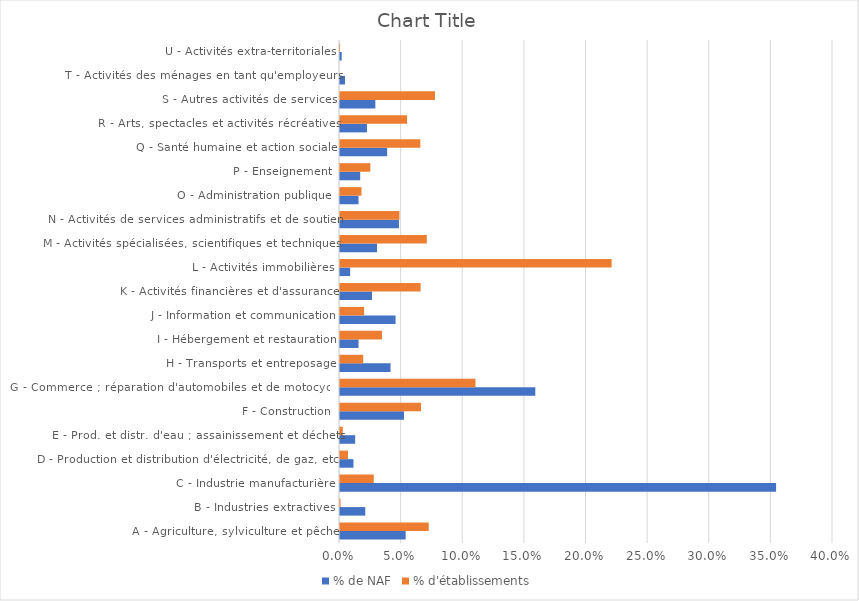
| Category | % de NAF | % d'établissements |
|---|---|---|
| A - Agriculture, sylviculture et pêche | 0.053 | 0.072 |
| B - Industries extractives | 0.02 | 0 |
| C - Industrie manufacturière | 0.354 | 0.027 |
| D - Production et distribution d'électricité, de gaz, etc. | 0.011 | 0.006 |
| E - Prod. et distr. d'eau ; assainissement et déchets | 0.012 | 0.002 |
| F - Construction | 0.052 | 0.066 |
| G - Commerce ; réparation d'automobiles et de motocycles | 0.158 | 0.11 |
| H - Transports et entreposage | 0.041 | 0.019 |
| I - Hébergement et restauration | 0.015 | 0.034 |
| J - Information et communication | 0.045 | 0.02 |
| K - Activités financières et d'assurance | 0.026 | 0.065 |
| L - Activités immobilières | 0.008 | 0.22 |
| M - Activités spécialisées, scientifiques et techniques | 0.03 | 0.07 |
| N - Activités de services administratifs et de soutien | 0.048 | 0.048 |
| O - Administration publique  | 0.015 | 0.017 |
| P - Enseignement | 0.016 | 0.025 |
| Q - Santé humaine et action sociale | 0.038 | 0.065 |
| R - Arts, spectacles et activités récréatives | 0.022 | 0.054 |
| S - Autres activités de services | 0.029 | 0.077 |
| T - Activités des ménages en tant qu'employeurs | 0.004 | 0 |
| U - Activités extra-territoriales | 0.001 | 0 |